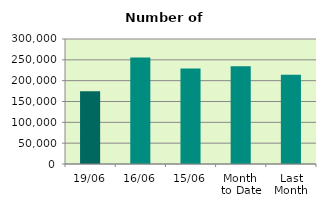
| Category | Series 0 |
|---|---|
| 19/06 | 174856 |
| 16/06 | 255720 |
| 15/06 | 228966 |
| Month 
to Date | 234700.769 |
| Last
Month | 214383.182 |